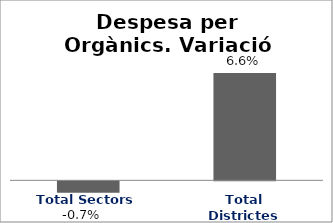
| Category | Series 0 |
|---|---|
| Total Sectors | -0.007 |
| Total Districtes | 0.066 |